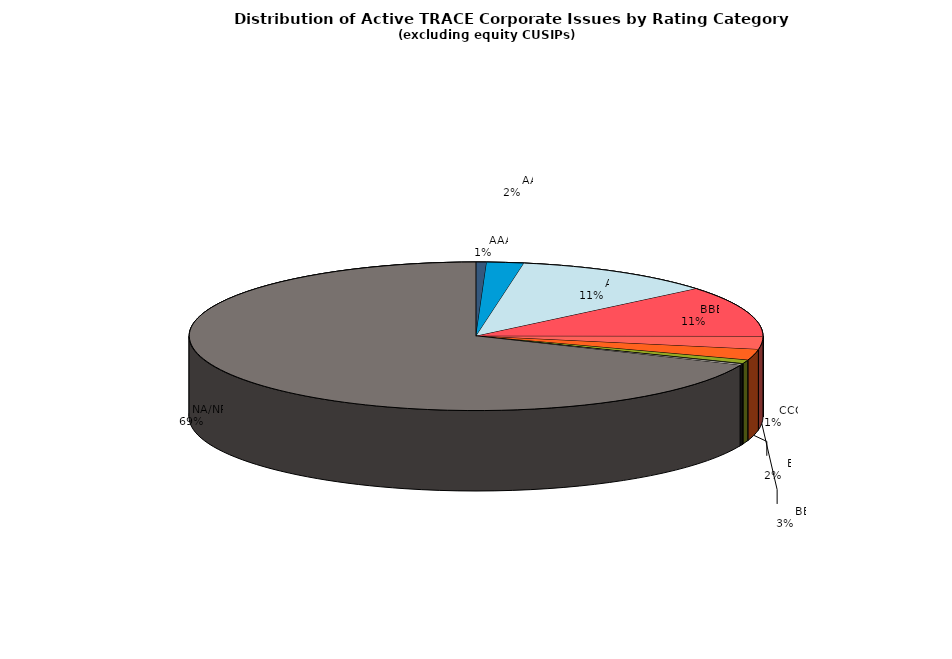
| Category | Series 0 |
|---|---|
|         AAA | 512 |
|         AA | 1789 |
|         A | 9660 |
|         BBB | 9508 |
|         BB | 2415 |
|         B | 2007 |
|         CCC | 678 |
|         CC | 94 |
|         C | 50 |
|         D | 201 |
|         NA/NR | 58793 |